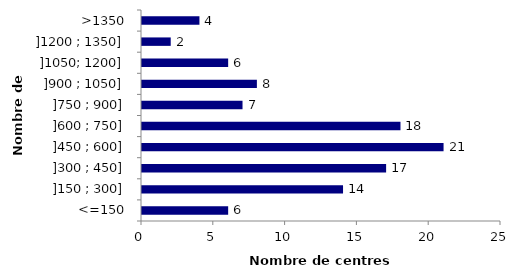
| Category | Series 0 |
|---|---|
| <=150 | 6 |
| ]150 ; 300] | 14 |
| ]300 ; 450] | 17 |
| ]450 ; 600] | 21 |
| ]600 ; 750] | 18 |
| ]750 ; 900] | 7 |
| ]900 ; 1050] | 8 |
| ]1050; 1200] | 6 |
| ]1200 ; 1350] | 2 |
| >1350 | 4 |